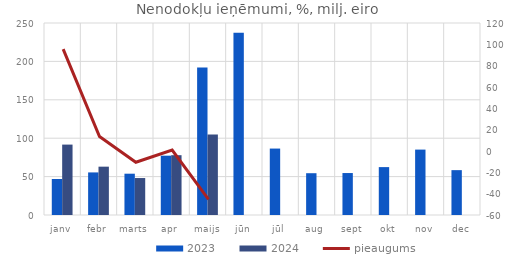
| Category | 2023 | 2024 |
|---|---|---|
| janv | 46.896 | 91.674 |
| febr | 55.445 | 62.936 |
| marts | 53.782 | 48.128 |
| apr | 77.237 | 77.884 |
| maijs | 192.092 | 104.818 |
| jūn | 237.322 | 0 |
| jūl | 86.507 | 0 |
| aug | 54.412 | 0 |
| sept | 54.638 | 0 |
| okt | 62.367 | 0 |
| nov | 85.157 | 0 |
| dec | 58.406 | 0 |